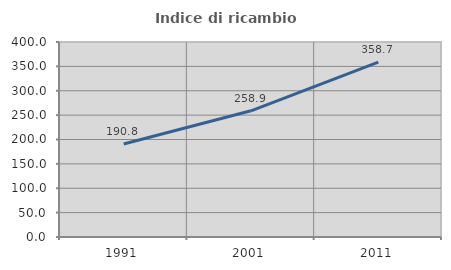
| Category | Indice di ricambio occupazionale  |
|---|---|
| 1991.0 | 190.794 |
| 2001.0 | 258.874 |
| 2011.0 | 358.654 |